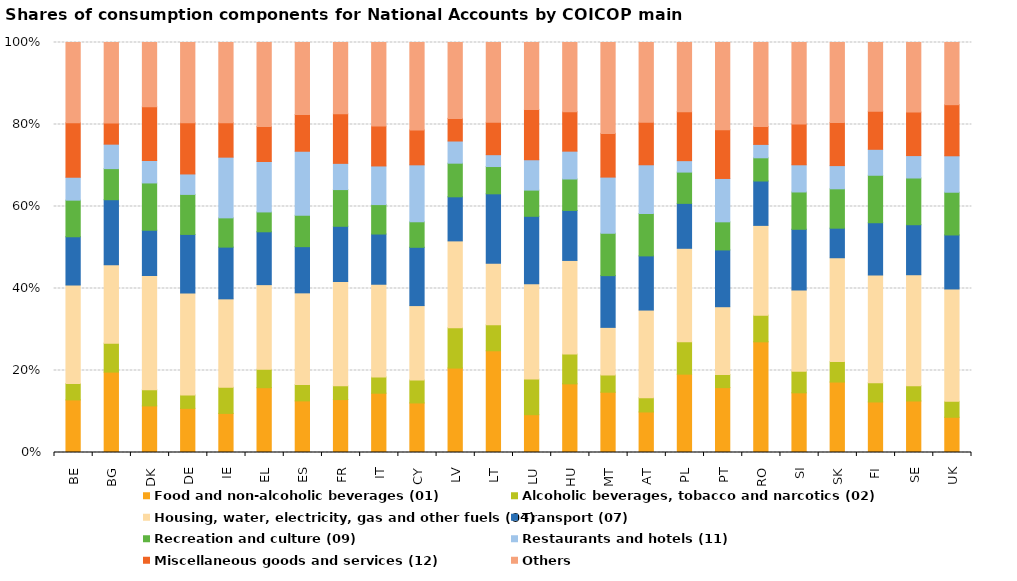
| Category | Food and non-alcoholic beverages (01) | Alcoholic beverages, tobacco and narcotics (02) | Housing, water, electricity, gas and other fuels (04) | Transport (07) | Recreation and culture (09) | Restaurants and hotels (11) | Miscellaneous goods and services (12) | Others |
|---|---|---|---|---|---|---|---|---|
| BE | 0.128 | 0.04 | 0.24 | 0.118 | 0.089 | 0.056 | 0.133 | 0.196 |
| BG | 0.196 | 0.071 | 0.191 | 0.159 | 0.076 | 0.06 | 0.051 | 0.197 |
| DK | 0.114 | 0.039 | 0.279 | 0.11 | 0.115 | 0.055 | 0.131 | 0.157 |
| DE | 0.108 | 0.033 | 0.249 | 0.143 | 0.098 | 0.05 | 0.125 | 0.196 |
| IE | 0.095 | 0.064 | 0.216 | 0.126 | 0.071 | 0.148 | 0.084 | 0.196 |
| EL | 0.158 | 0.045 | 0.206 | 0.129 | 0.048 | 0.123 | 0.085 | 0.205 |
| ES | 0.126 | 0.04 | 0.224 | 0.113 | 0.076 | 0.156 | 0.089 | 0.176 |
| FR | 0.129 | 0.034 | 0.254 | 0.135 | 0.09 | 0.064 | 0.121 | 0.174 |
| IT | 0.145 | 0.04 | 0.226 | 0.122 | 0.072 | 0.094 | 0.097 | 0.204 |
| CY | 0.121 | 0.056 | 0.181 | 0.142 | 0.062 | 0.139 | 0.085 | 0.213 |
| LV | 0.206 | 0.098 | 0.212 | 0.107 | 0.082 | 0.054 | 0.055 | 0.185 |
| LT | 0.248 | 0.063 | 0.15 | 0.17 | 0.067 | 0.029 | 0.079 | 0.195 |
| LU | 0.092 | 0.087 | 0.233 | 0.164 | 0.064 | 0.074 | 0.122 | 0.163 |
| HU | 0.167 | 0.073 | 0.228 | 0.122 | 0.077 | 0.068 | 0.096 | 0.169 |
| MT | 0.147 | 0.042 | 0.116 | 0.126 | 0.103 | 0.137 | 0.107 | 0.222 |
| AT | 0.099 | 0.035 | 0.214 | 0.132 | 0.103 | 0.119 | 0.104 | 0.194 |
| PL | 0.191 | 0.079 | 0.228 | 0.11 | 0.076 | 0.028 | 0.119 | 0.169 |
| PT | 0.158 | 0.032 | 0.165 | 0.138 | 0.069 | 0.106 | 0.119 | 0.213 |
| RO | 0.27 | 0.065 | 0.219 | 0.108 | 0.057 | 0.033 | 0.044 | 0.205 |
| SI | 0.146 | 0.053 | 0.198 | 0.148 | 0.091 | 0.066 | 0.099 | 0.199 |
| SK | 0.172 | 0.05 | 0.253 | 0.072 | 0.096 | 0.057 | 0.105 | 0.195 |
| FI | 0.123 | 0.047 | 0.263 | 0.127 | 0.116 | 0.063 | 0.093 | 0.167 |
| SE | 0.126 | 0.037 | 0.271 | 0.122 | 0.114 | 0.055 | 0.106 | 0.17 |
| UK | 0.086 | 0.039 | 0.274 | 0.132 | 0.104 | 0.089 | 0.125 | 0.152 |